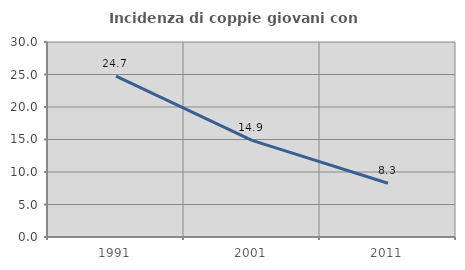
| Category | Incidenza di coppie giovani con figli |
|---|---|
| 1991.0 | 24.742 |
| 2001.0 | 14.869 |
| 2011.0 | 8.275 |